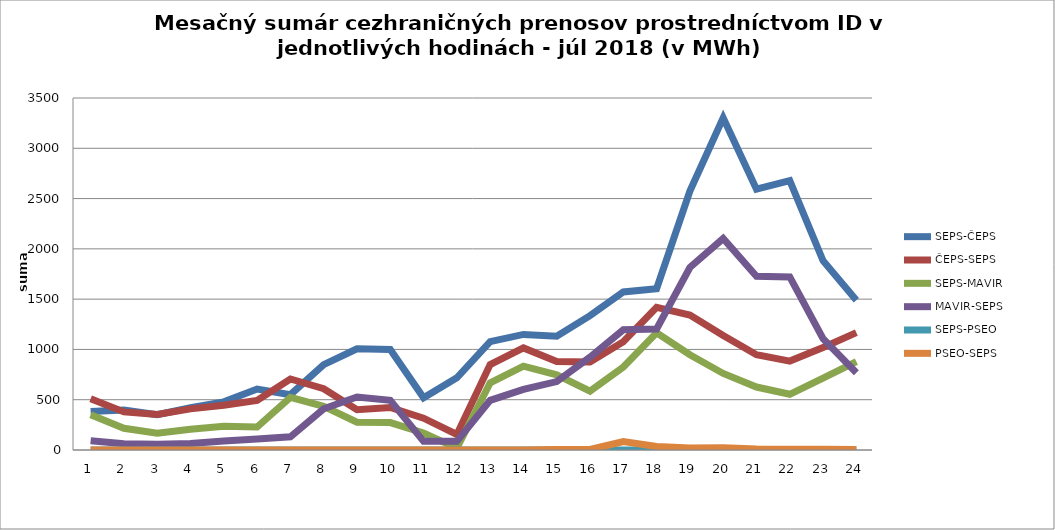
| Category | SEPS-ČEPS | ČEPS-SEPS | SEPS-MAVIR | MAVIR-SEPS | SEPS-PSEO | PSEO-SEPS |
|---|---|---|---|---|---|---|
| 1.0 | 383 | 510 | 351 | 93 | 0 | 0 |
| 2.0 | 398 | 379 | 216 | 62 | 0 | 0 |
| 3.0 | 352 | 353 | 166 | 57 | 0 | 0 |
| 4.0 | 420 | 409 | 206 | 64 | 0 | 0 |
| 5.0 | 479 | 445 | 236 | 89 | 0 | 0 |
| 6.0 | 606 | 493 | 228 | 110 | 0 | 0 |
| 7.0 | 550 | 706 | 524 | 131 | 0 | 0 |
| 8.0 | 848 | 609 | 435 | 410 | 0 | 0 |
| 9.0 | 1006 | 400 | 277 | 527 | 0 | 0 |
| 10.0 | 999 | 423 | 273 | 494 | 0 | 0 |
| 11.0 | 520 | 316 | 169 | 86 | 0 | 0 |
| 12.0 | 718 | 154 | 19 | 86 | 0 | 0 |
| 13.0 | 1078 | 849 | 668 | 494 | 0 | 0 |
| 14.0 | 1149 | 1015 | 833 | 602 | 0 | 0 |
| 15.0 | 1131 | 880 | 747 | 680 | 0 | 5 |
| 16.0 | 1336 | 876 | 585 | 923 | 0 | 5 |
| 17.0 | 1571 | 1077 | 825 | 1195 | 0 | 83 |
| 18.0 | 1604 | 1418 | 1166 | 1203 | 0 | 35 |
| 19.0 | 2574 | 1342 | 947 | 1815 | 0 | 20 |
| 20.0 | 3303 | 1139 | 761 | 2103 | 0 | 23 |
| 21.0 | 2593 | 947 | 626 | 1727 | 0 | 10 |
| 22.0 | 2679 | 884 | 554 | 1721 | 0 | 8 |
| 23.0 | 1882 | 1020 | 714 | 1106 | 0 | 8 |
| 24.0 | 1490 | 1167 | 878 | 768 | 0 | 5 |